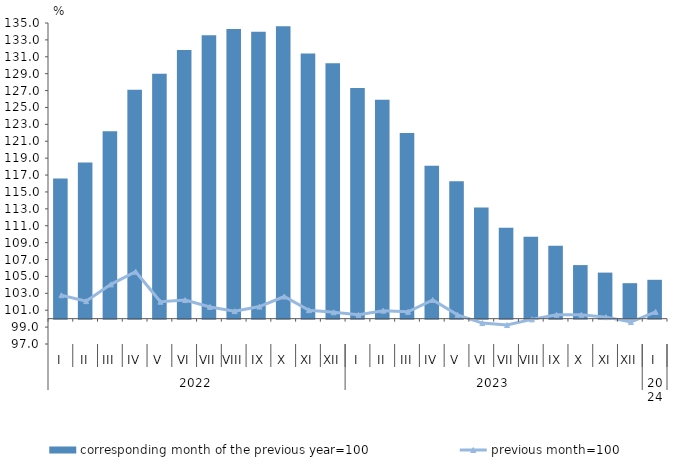
| Category | corresponding month of the previous year=100 |
|---|---|
| 0 | 116.6 |
| 1 | 118.5 |
| 2 | 122.2 |
| 3 | 127.1 |
| 4 | 129 |
| 5 | 131.8 |
| 6 | 133.55 |
| 7 | 134.29 |
| 8 | 133.97 |
| 9 | 134.62 |
| 10 | 131.4 |
| 11 | 130.24 |
| 12 | 127.307 |
| 13 | 125.905 |
| 14 | 121.977 |
| 15 | 118.102 |
| 16 | 116.262 |
| 17 | 113.152 |
| 18 | 110.755 |
| 19 | 109.689 |
| 20 | 108.634 |
| 21 | 106.342 |
| 22 | 105.453 |
| 23 | 104.2 |
| 24 | 104.6 |